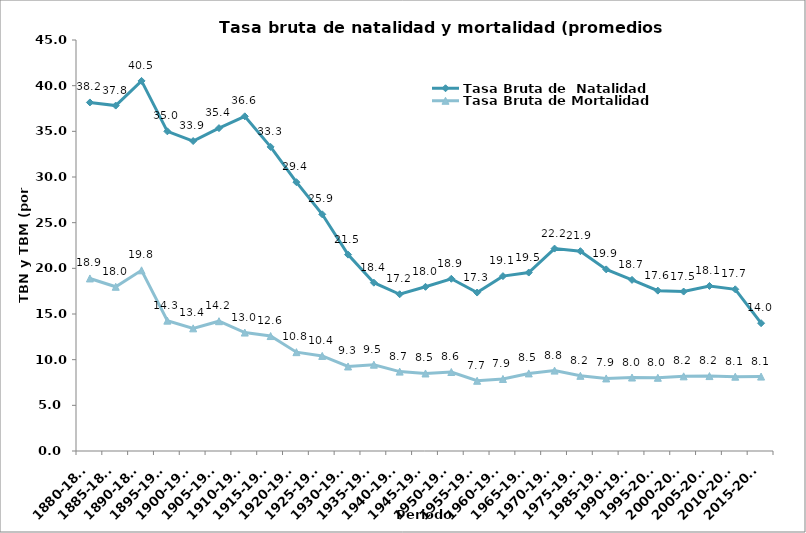
| Category | Tasa Bruta de  Natalidad | Tasa Bruta de Mortalidad |
|---|---|---|
| 1880-1885 | 38.163 | 18.892 |
| 1885-1890 | 37.82 | 17.983 |
| 1890-1895 | 40.521 | 19.783 |
| 1895-1900 | 35.001 | 14.274 |
| 1900-1905 | 33.937 | 13.43 |
| 1905-1910 | 35.352 | 14.212 |
| 1910-1915 | 36.643 | 12.966 |
| 1915-1920 | 33.297 | 12.586 |
| 1920-1925 | 29.432 | 10.821 |
| 1925-1930 | 25.915 | 10.413 |
| 1930-1935 | 21.501 | 9.254 |
| 1935-1940 | 18.432 | 9.45 |
| 1940-1945 | 17.161 | 8.691 |
| 1945-1950 | 17.977 | 8.487 |
| 1950-1955 | 18.856 | 8.649 |
| 1955-1960 | 17.348 | 7.691 |
| 1960-1965 | 19.146 | 7.887 |
| 1965-1970 | 19.538 | 8.495 |
| 1970-1975 | 22.162 | 8.803 |
| 1975-1980 | 21.88 | 8.231 |
| 1985-1990 | 19.886 | 7.944 |
| 1990-1995 | 18.736 | 8.045 |
| 1995-2000 | 17.558 | 8.017 |
| 2000-2005 | 17.457 | 8.173 |
| 2005-2010 | 18.07 | 8.202 |
| 2010-2015 | 17.704 | 8.136 |
| 2015-2020 | 13.993 | 8.147 |